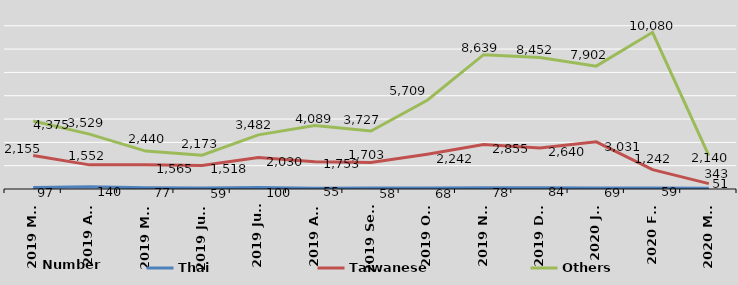
| Category | Thai | Taiwanese | Others |
|---|---|---|---|
| 2019 Mar | 97 | 2155 | 4375 |
| 2019 Apr | 140 | 1552 | 3529 |
| 2019 May | 77 | 1565 | 2440 |
| 2019 June | 59 | 1518 | 2173 |
| 2019 July | 100 | 2030 | 3482 |
| 2019 Aug | 55 | 1753 | 4089 |
| 2019 Sept | 58 | 1703 | 3727 |
| 2019 Oct | 68 | 2242 | 5709 |
| 2019 Nov | 78 | 2855 | 8639 |
| 2019 Dec | 84 | 2640 | 8452 |
| 2020 Jan | 69 | 3031 | 7902 |
| 2020 Feb | 59 | 1242 | 10080 |
| 2020 Mar | 51 | 343 | 2140 |